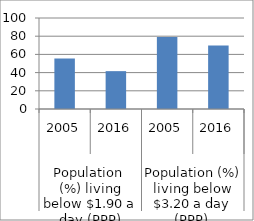
| Category | Series 0 |
|---|---|
| 0 | 55.4 |
| 1 | 41.6 |
| 2 | 79.2 |
| 3 | 69.8 |